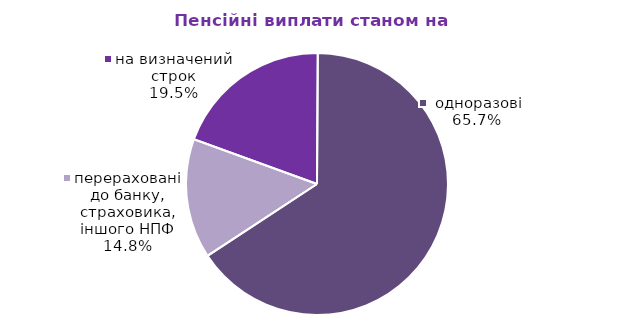
| Category | Series 0 |
|---|---|
| на визначений строк | 127.048 |
|  одноразові | 426.907 |
| перераховані до банку, страховика, іншого НПФ | 96.243 |